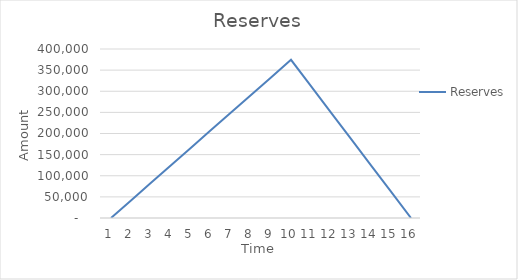
| Category | Reserves |
|---|---|
| 0 | 0 |
| 1 | 41600 |
| 2 | 83200 |
| 3 | 124800 |
| 4 | 166400 |
| 5 | 208000 |
| 6 | 249600 |
| 7 | 291200 |
| 8 | 332800 |
| 9 | 374400 |
| 10 | 312000 |
| 11 | 249600 |
| 12 | 187200 |
| 13 | 124800 |
| 14 | 62400 |
| 15 | 0 |